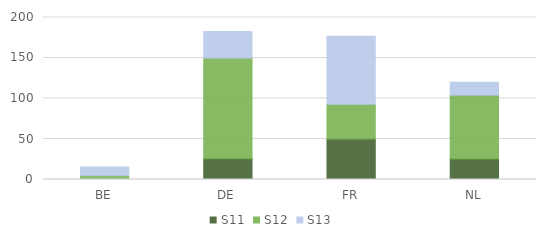
| Category | S11 | S12 | S13 |
|---|---|---|---|
| BE | 0 | 4.646 | 10.681 |
| DE | 25.647 | 123.959 | 33.026 |
| FR | 49.615 | 43.053 | 84.202 |
| NL | 25.406 | 78.484 | 16.068 |